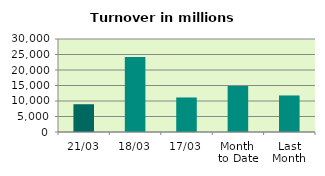
| Category | Series 0 |
|---|---|
| 21/03 | 8955.631 |
| 18/03 | 24193.211 |
| 17/03 | 11142.379 |
| Month 
to Date | 14832.691 |
| Last
Month | 11787.675 |